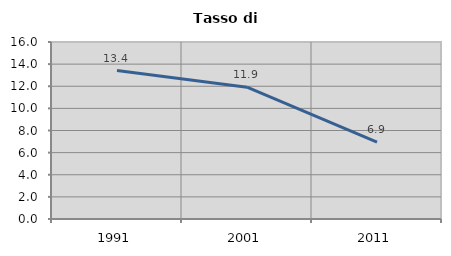
| Category | Tasso di disoccupazione   |
|---|---|
| 1991.0 | 13.42 |
| 2001.0 | 11.915 |
| 2011.0 | 6.944 |